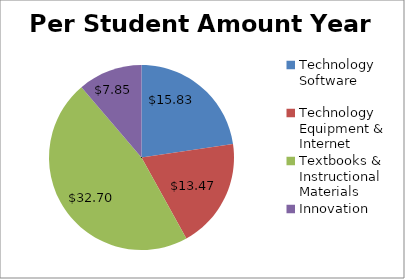
| Category | Per Student Amount Year One |
|---|---|
| Technology Software | 15.832 |
| Technology Equipment & Internet | 13.465 |
| Textbooks & Instructional Materials | 32.7 |
| Innovation | 7.852 |